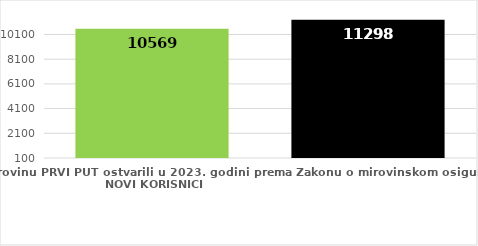
| Category | broj korisnika |
|---|---|
| Korisnici koji su pravo na mirovinu PRVI PUT ostvarili u 2023. godini prema Zakonu o mirovinskom osiguranju - NOVI KORISNICI | 10569 |
| Korisnici mirovina kojima je u 2023. godini PRESTALO PRAVO NA MIROVINU - uzrok smrt 
koji su pravo na mirovinu ostvarili prema Zakonu o mirovinskom osiguranju | 11298 |